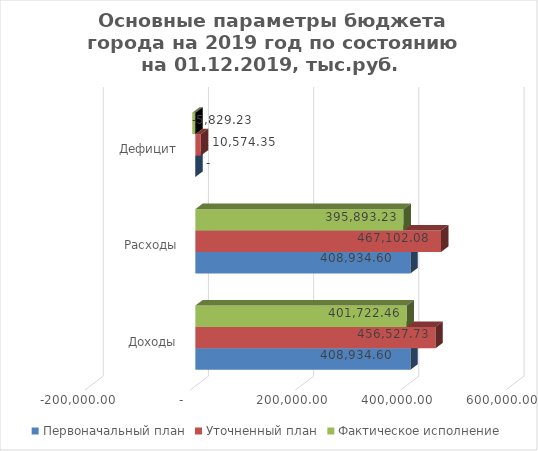
| Category | Первоначальный план | Уточненный план | Фактическое исполнение |
|---|---|---|---|
| Доходы | 408934.598 | 456527.732 | 401722.459 |
| Расходы | 408934.598 | 467102.08 | 395893.225 |
| Дефицит | 0 | 10574.348 | -5829.234 |